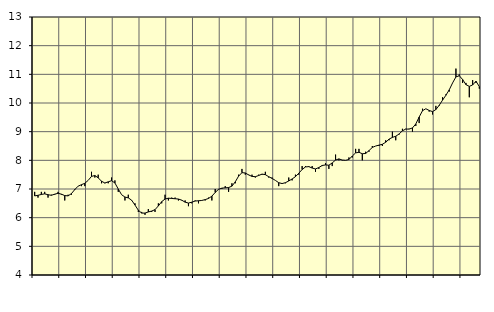
| Category | Piggar | Offentlig förvaltning m.m., SNI 84, 99 |
|---|---|---|
| nan | 6.9 | 6.76 |
| 87.0 | 6.7 | 6.78 |
| 87.0 | 6.9 | 6.81 |
| 87.0 | 6.9 | 6.83 |
| nan | 6.7 | 6.8 |
| 88.0 | 6.8 | 6.78 |
| 88.0 | 6.8 | 6.82 |
| 88.0 | 6.9 | 6.85 |
| nan | 6.8 | 6.82 |
| 89.0 | 6.6 | 6.77 |
| 89.0 | 6.8 | 6.76 |
| 89.0 | 6.8 | 6.84 |
| nan | 7 | 6.98 |
| 90.0 | 7.1 | 7.1 |
| 90.0 | 7.1 | 7.15 |
| 90.0 | 7.1 | 7.2 |
| nan | 7.3 | 7.3 |
| 91.0 | 7.6 | 7.44 |
| 91.0 | 7.4 | 7.47 |
| 91.0 | 7.5 | 7.39 |
| nan | 7.2 | 7.27 |
| 92.0 | 7.2 | 7.21 |
| 92.0 | 7.2 | 7.25 |
| 92.0 | 7.4 | 7.29 |
| nan | 7.3 | 7.21 |
| 93.0 | 6.9 | 7 |
| 93.0 | 6.8 | 6.8 |
| 93.0 | 6.6 | 6.72 |
| nan | 6.8 | 6.69 |
| 94.0 | 6.6 | 6.61 |
| 94.0 | 6.5 | 6.44 |
| 94.0 | 6.2 | 6.26 |
| nan | 6.2 | 6.16 |
| 95.0 | 6.1 | 6.16 |
| 95.0 | 6.3 | 6.2 |
| 95.0 | 6.2 | 6.23 |
| nan | 6.2 | 6.28 |
| 96.0 | 6.5 | 6.41 |
| 96.0 | 6.5 | 6.56 |
| 96.0 | 6.8 | 6.65 |
| nan | 6.6 | 6.68 |
| 97.0 | 6.7 | 6.67 |
| 97.0 | 6.7 | 6.66 |
| 97.0 | 6.6 | 6.65 |
| nan | 6.6 | 6.61 |
| 98.0 | 6.6 | 6.54 |
| 98.0 | 6.4 | 6.51 |
| 98.0 | 6.5 | 6.54 |
| nan | 6.6 | 6.58 |
| 99.0 | 6.5 | 6.59 |
| 99.0 | 6.6 | 6.6 |
| 99.0 | 6.6 | 6.63 |
| nan | 6.7 | 6.67 |
| 0.0 | 6.6 | 6.75 |
| 0.0 | 7 | 6.88 |
| 0.0 | 7 | 6.99 |
| nan | 7 | 7.03 |
| 1.0 | 7.1 | 7.04 |
| 1.0 | 6.9 | 7.05 |
| 1.0 | 7.2 | 7.1 |
| nan | 7.2 | 7.25 |
| 2.0 | 7.5 | 7.45 |
| 2.0 | 7.7 | 7.57 |
| 2.0 | 7.5 | 7.56 |
| nan | 7.5 | 7.49 |
| 3.0 | 7.5 | 7.44 |
| 3.0 | 7.4 | 7.43 |
| 3.0 | 7.5 | 7.47 |
| nan | 7.5 | 7.52 |
| 4.0 | 7.6 | 7.5 |
| 4.0 | 7.4 | 7.43 |
| 4.0 | 7.4 | 7.37 |
| nan | 7.3 | 7.3 |
| 5.0 | 7.1 | 7.22 |
| 5.0 | 7.2 | 7.19 |
| 5.0 | 7.2 | 7.22 |
| nan | 7.4 | 7.28 |
| 6.0 | 7.3 | 7.35 |
| 6.0 | 7.5 | 7.43 |
| 6.0 | 7.5 | 7.55 |
| nan | 7.8 | 7.68 |
| 7.0 | 7.8 | 7.77 |
| 7.0 | 7.8 | 7.78 |
| 7.0 | 7.8 | 7.73 |
| nan | 7.6 | 7.7 |
| 8.0 | 7.7 | 7.75 |
| 8.0 | 7.8 | 7.82 |
| 8.0 | 7.9 | 7.84 |
| nan | 7.7 | 7.83 |
| 9.0 | 7.8 | 7.91 |
| 9.0 | 8.2 | 8.01 |
| 9.0 | 8 | 8.05 |
| nan | 8 | 8.01 |
| 10.0 | 8 | 8 |
| 10.0 | 8.1 | 8.03 |
| 10.0 | 8.1 | 8.15 |
| nan | 8.4 | 8.26 |
| 11.0 | 8.4 | 8.28 |
| 11.0 | 8 | 8.23 |
| 11.0 | 8.3 | 8.24 |
| nan | 8.3 | 8.34 |
| 12.0 | 8.5 | 8.45 |
| 12.0 | 8.5 | 8.5 |
| 12.0 | 8.5 | 8.53 |
| nan | 8.5 | 8.56 |
| 13.0 | 8.7 | 8.63 |
| 13.0 | 8.7 | 8.74 |
| 13.0 | 9 | 8.8 |
| nan | 8.7 | 8.84 |
| 14.0 | 8.9 | 8.92 |
| 14.0 | 9.1 | 9.03 |
| 14.0 | 9.1 | 9.09 |
| nan | 9.1 | 9.09 |
| 15.0 | 9 | 9.13 |
| 15.0 | 9.2 | 9.27 |
| 15.0 | 9.3 | 9.51 |
| nan | 9.8 | 9.73 |
| 16.0 | 9.8 | 9.8 |
| 16.0 | 9.7 | 9.74 |
| 16.0 | 9.6 | 9.7 |
| nan | 9.9 | 9.77 |
| 17.0 | 9.9 | 9.92 |
| 17.0 | 10.2 | 10.1 |
| 17.0 | 10.3 | 10.27 |
| nan | 10.4 | 10.46 |
| 18.0 | 10.7 | 10.7 |
| 18.0 | 11.2 | 10.91 |
| 18.0 | 11 | 10.95 |
| nan | 10.7 | 10.82 |
| 19.0 | 10.7 | 10.64 |
| 19.0 | 10.2 | 10.58 |
| 19.0 | 10.8 | 10.63 |
| nan | 10.7 | 10.76 |
| 20.0 | 10.5 | 10.57 |